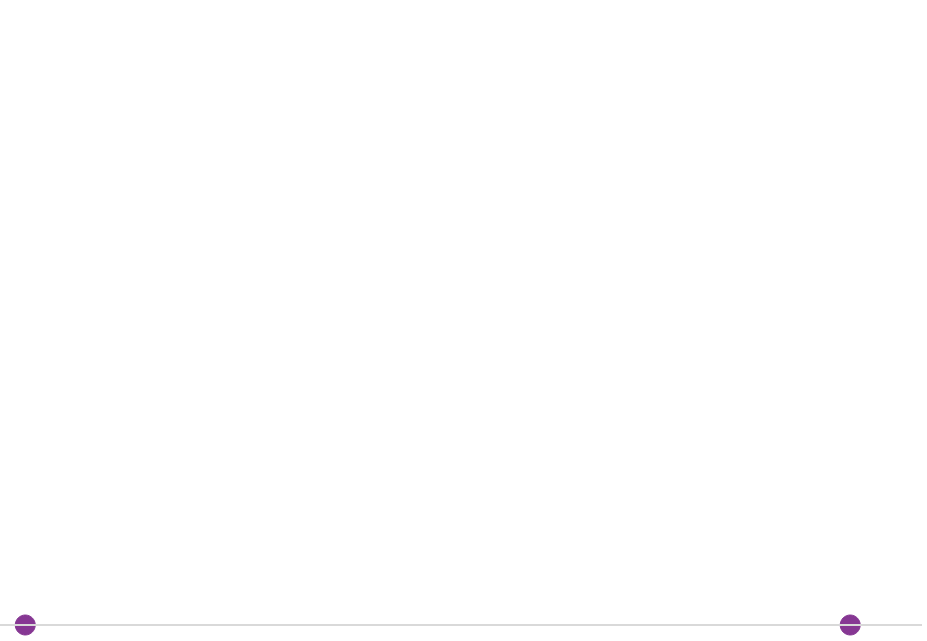
| Category | Series 0 |
|---|---|
| 0 | 0 |
| 1 | 0 |
| 2 | 0 |
| 3 | 0 |
| 4 | 0 |
| 5 | 0 |
| 6 | 0 |
| 7 | 0 |
| 8 | 0 |
| 9 | 0 |
| 10 | 0 |
| 11 | 0 |
| 12 | 0 |
| 13 | 0 |
| 14 | 0 |
| 15 | 0 |
| 16 | 0 |
| 17 | 0 |
| 18 | 0 |